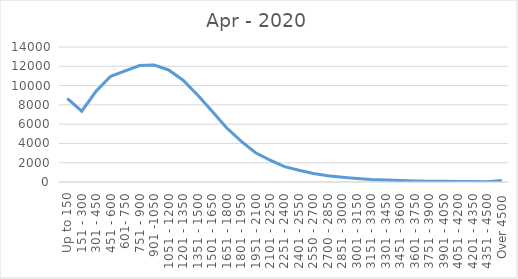
| Category | Apr - 2020 |
|---|---|
| Up to 150 | 8672 |
| 151 - 300 | 7346 |
| 301 - 450 | 9429 |
| 451 - 600 | 10964 |
| 601- 750 | 11518 |
| 751 - 900 | 12071 |
| 901 -1050 | 12125 |
| 1051 - 1200 | 11619 |
| 1201 - 1350 | 10559 |
| 1351 - 1500 | 9026 |
| 1501 - 1650 | 7325 |
| 1651 - 1800 | 5628 |
| 1801 - 1950 | 4232 |
| 1951 - 2100 | 3032 |
| 2101 - 2250 | 2264 |
| 2251 - 2400 | 1596 |
| 2401 - 2550 | 1219 |
| 2550 - 2700 | 888 |
| 2700 - 2850 | 646 |
| 2851 - 3000 | 504 |
| 3001 - 3150 | 373 |
| 3151 - 3300 | 267 |
| 3301 - 3450 | 217 |
| 3451 - 3600 | 150 |
| 3601 - 3750 | 112 |
| 3751 - 3900 | 67 |
| 3901 - 4050 | 66 |
| 4051 - 4200 | 56 |
| 4201 - 4350 | 41 |
| 4351 - 4500 | 33 |
| Over 4500 | 169 |